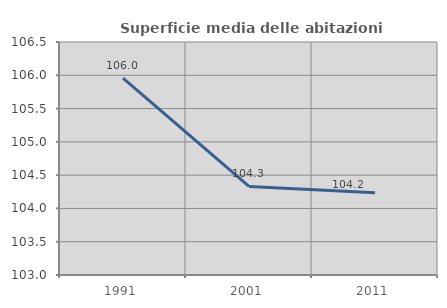
| Category | Superficie media delle abitazioni occupate |
|---|---|
| 1991.0 | 105.959 |
| 2001.0 | 104.33 |
| 2011.0 | 104.235 |